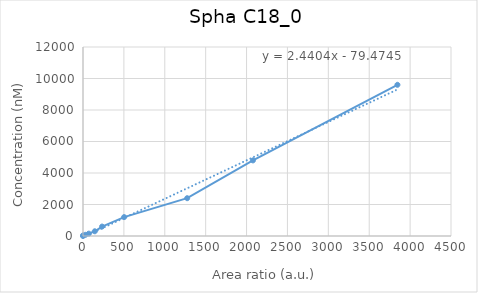
| Category | Spha C18_0  |
|---|---|
| 0.0 | 0 |
| 0.564835945658399 | 37.5 |
| 29.0898661718077 | 75 |
| 70.7808573579259 | 150 |
| 144.306220268187 | 300 |
| 233.218622673078 | 600 |
| 502.864583978273 | 1200 |
| 1273.92359687678 | 2400 |
| 2077.94772477225 | 4800 |
| 3845.09059736671 | 9600 |